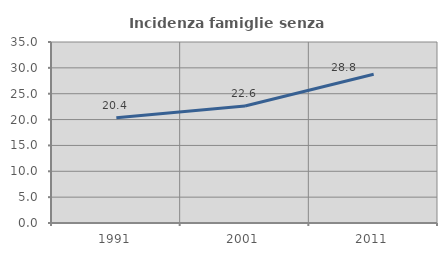
| Category | Incidenza famiglie senza nuclei |
|---|---|
| 1991.0 | 20.359 |
| 2001.0 | 22.621 |
| 2011.0 | 28.777 |